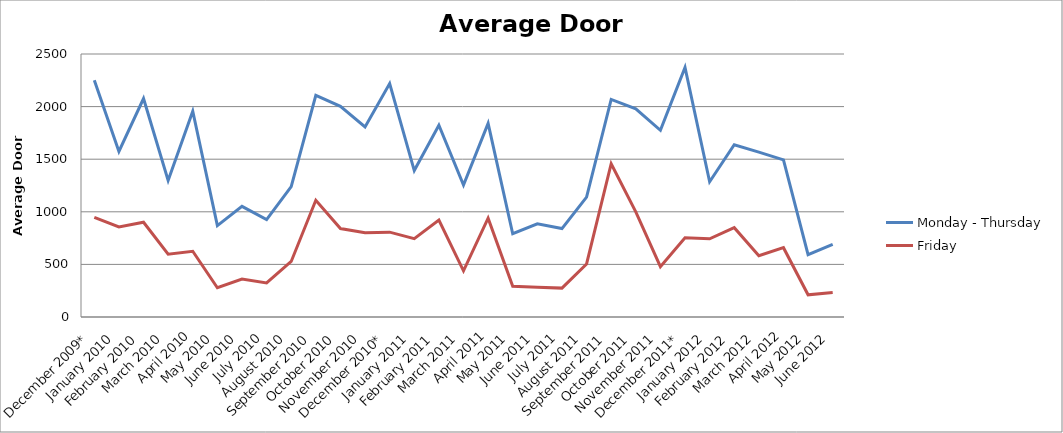
| Category | Monday - Thursday | Friday |
|---|---|---|
| December 2009* | 2249.867 | 947.96 |
| January 2010 | 1573.975 | 856.57 |
| February 2010 | 2076.815 | 900.64 |
| March 2010 | 1297.537 | 597.35 |
| April 2010 | 1955.965 | 625.144 |
| May 2010 | 869.226 | 278.33 |
| June 2010 | 1051.931 | 360.62 |
| July 2010 | 925.722 | 323.648 |
| August 2010 | 1238.958 | 527.8 |
| September 2010 | 2107.127 | 1109.42 |
| October 2010 | 2003.118 | 840.84 |
| November 2010 | 1805.931 | 800.28 |
| December 2010* | 2219.36 | 806.52 |
| January 2011 | 1392.101 | 744.25 |
| February 2011 | 1823.38 | 921.05 |
| March 2011 | 1254.787 | 438.75 |
| April 2011 | 1840.54 | 939.536 |
| May 2011 | 791.624 | 291.98 |
| June 2011 | 886.04 | 282.88 |
| July 2011 | 840.56 | 274.664 |
| August 2011 | 1139.594 | 504.01 |
| September 2011 | 2068.529 | 1456.728 |
| October 2011 | 1979.12 | 998.79 |
| November 2011 | 1774.962 | 478.66 |
| December 2011* | 2373.28 | 752.44 |
| January 2012 | 1285.498 | 742.95 |
| February 2012 | 1637.419 | 849.29 |
| March 2012 | 1567 | 582.92 |
| April 2012 | 1493.685 | 658.84 |
| May 2012 | 592.453 | 210.99 |
| June 2012 | 689.488 | 234 |